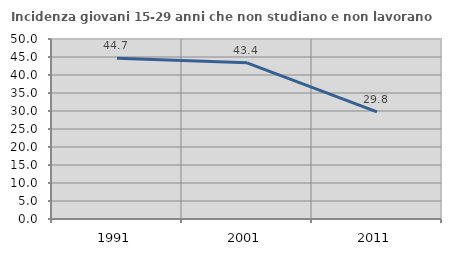
| Category | Incidenza giovani 15-29 anni che non studiano e non lavorano  |
|---|---|
| 1991.0 | 44.651 |
| 2001.0 | 43.389 |
| 2011.0 | 29.758 |